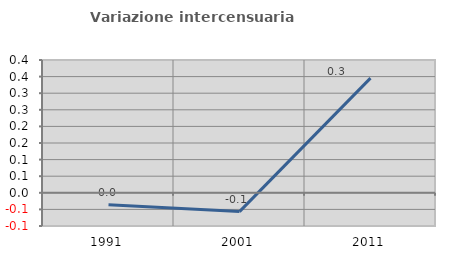
| Category | Variazione intercensuaria annua |
|---|---|
| 1991.0 | -0.036 |
| 2001.0 | -0.057 |
| 2011.0 | 0.345 |